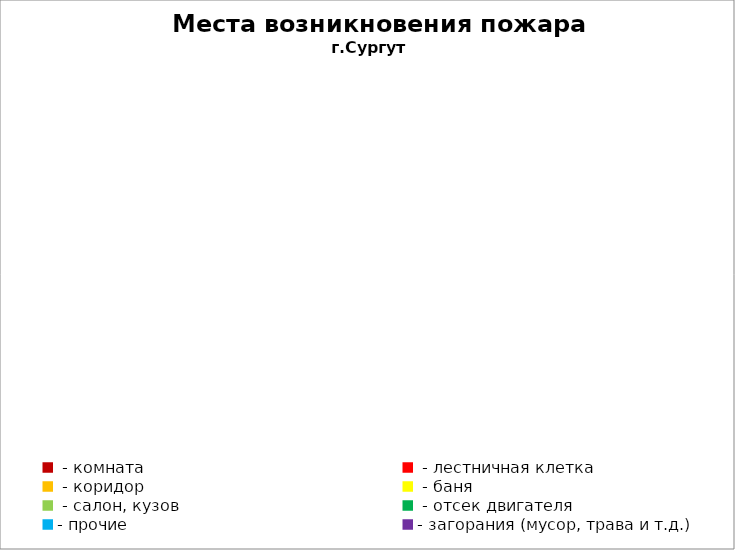
| Category | Места возникновения пожара |
|---|---|
|  - комната | 69 |
|  - лестничная клетка | 28 |
|  - коридор | 12 |
|  - баня | 32 |
|  - салон, кузов | 15 |
|  - отсек двигателя | 59 |
| - прочие | 192 |
| - загорания (мусор, трава и т.д.)  | 185 |